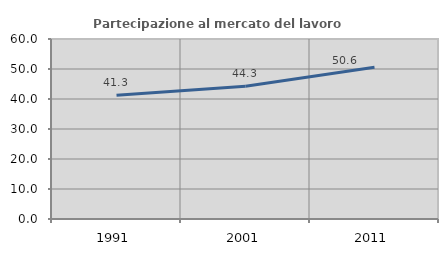
| Category | Partecipazione al mercato del lavoro  femminile |
|---|---|
| 1991.0 | 41.288 |
| 2001.0 | 44.271 |
| 2011.0 | 50.601 |